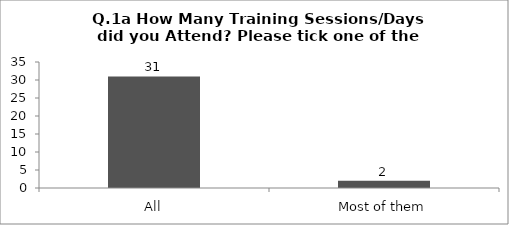
| Category | Q.1a How Many Training Sessions/Days did you Attend? Please tick one of the answers below |
|---|---|
| All | 31 |
| Most of them | 2 |